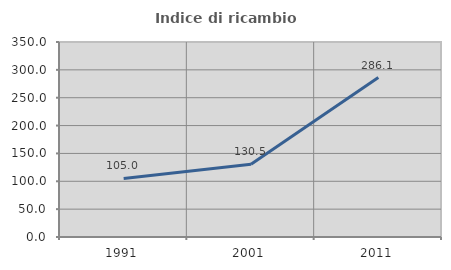
| Category | Indice di ricambio occupazionale  |
|---|---|
| 1991.0 | 105.013 |
| 2001.0 | 130.528 |
| 2011.0 | 286.111 |